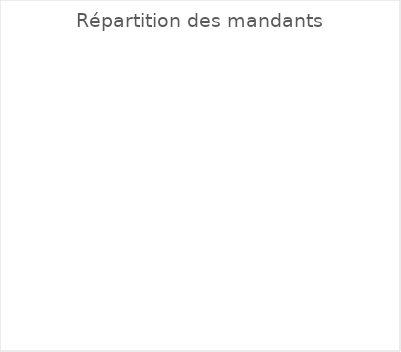
| Category | Series 0 |
|---|---|
| BE | 0 |
| FR | 0 |
| GE | 0 |
| JU | 0 |
| NE | 0 |
| TI | 0 |
| VD | 0 |
| VS | 0 |
| SO | 0 |
| BS | 0 |
| BL | 0 |
| Autres | 0 |